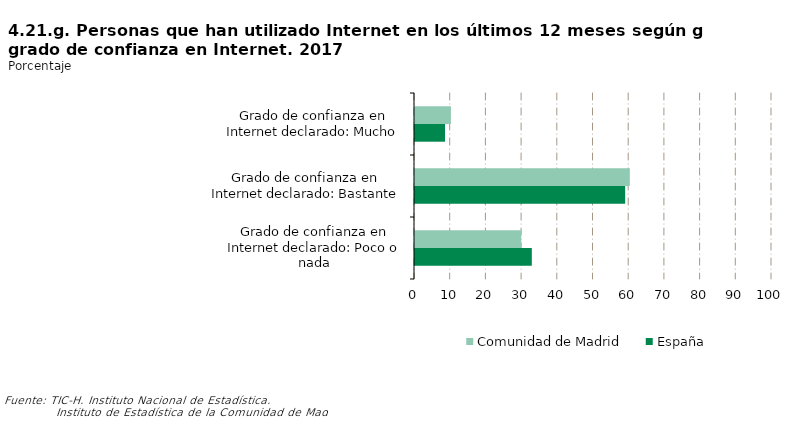
| Category | Comunidad de Madrid | España |
|---|---|---|
| Grado de confianza en Internet declarado: Mucho | 10.058 | 8.413 |
| Grado de confianza en Internet declarado: Bastante | 60.176 | 58.867 |
| Grado de confianza en Internet declarado: Poco o nada | 29.766 | 32.721 |